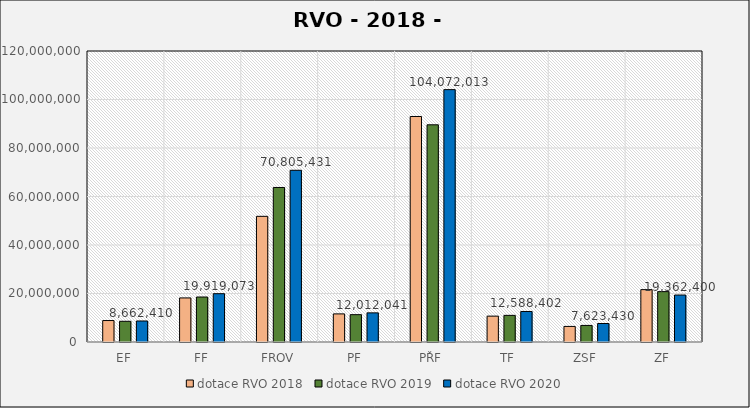
| Category | dotace RVO 2018  | dotace RVO 2019  | dotace RVO 2020  |
|---|---|---|---|
| EF | 8852844 | 8539741 | 8662409.929 |
| FF | 18171550 | 18546423 | 19919073.018 |
| FROV | 51821464 | 63721493 | 70805430.567 |
| PF | 11586620 | 11274733 | 12012041.109 |
| PŘF | 92992436 | 89563833 | 104072012.763 |
| TF | 10667823 | 10981105 | 12588402.29 |
| ZSF | 6423662 | 6831790 | 7623430.448 |
| ZF | 21597839 | 20766897 | 19362399.751 |